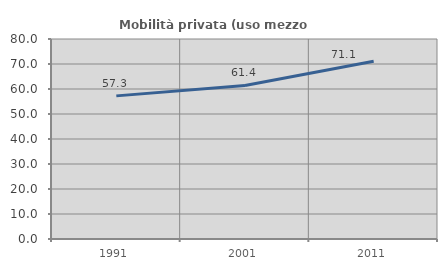
| Category | Mobilità privata (uso mezzo privato) |
|---|---|
| 1991.0 | 57.252 |
| 2001.0 | 61.409 |
| 2011.0 | 71.123 |